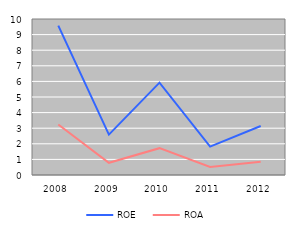
| Category | ROE | ROA |
|---|---|---|
| 2008 | 9.58 | 3.239 |
| 2009 | 2.59 | 0.782 |
| 2010 | 5.92 | 1.72 |
| 2011 | 1.82 | 0.519 |
| 2012 | 3.14 | 0.849 |